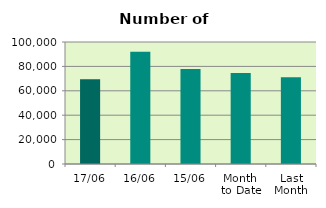
| Category | Series 0 |
|---|---|
| 17/06 | 69404 |
| 16/06 | 92062 |
| 15/06 | 77792 |
| Month 
to Date | 74560.462 |
| Last
Month | 71072.3 |